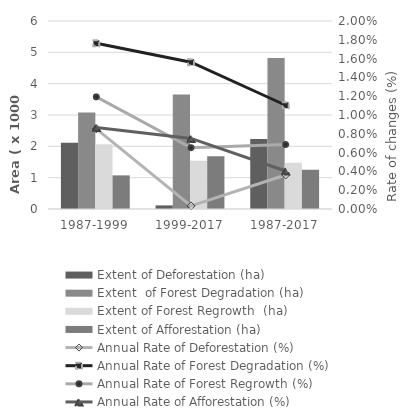
| Category | Extent of Deforestation (ha) | Extent  of Forest Degradation (ha) | Extent of Forest Regrowth  (ha) | Extent of Afforestation (ha) |
|---|---|---|---|---|
| 1987-1999 | 2116.53 | 3079.62 | 2064.42 | 1073.52 |
| 1999-2017 | 115.02 | 3653.19 | 1541.25 | 1679.85 |
| 1987-2017 | 2231.55 | 4820.22 | 1475.19 | 1252.26 |